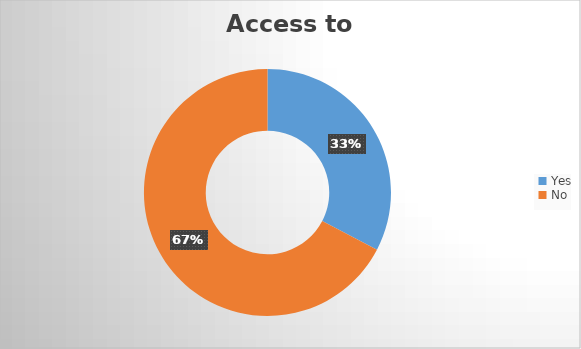
| Category | Series 0 |
|---|---|
| Yes | 0.327 |
| No | 0.673 |